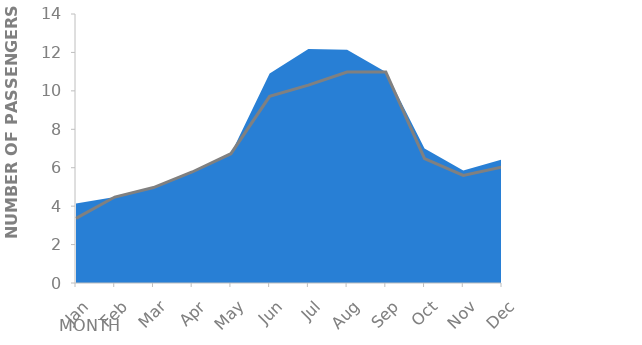
| Category | Family |
|---|---|
| Jan | 3361 |
| Feb | 4474 |
| Mar | 4966 |
| Apr | 5777 |
| May | 6729 |
| Jun | 9717 |
| Jul | 10297 |
| Aug | 10978 |
| Sep | 10977 |
| Oct | 6473 |
| Nov | 5603 |
| Dec | 6038 |